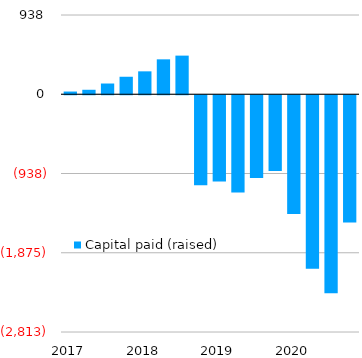
| Category | Capital paid (raised) |
|---|---|
| 2017 | 32 |
|  | 53 |
|  | 127 |
|  | 207 |
| 2018 | 271 |
|  | 413 |
|  | 457 |
|  | -1065 |
| 2019 | -1019 |
|  | -1151.9 |
|  | -979 |
|  | -897 |
| 2020 | -1406 |
|  | -2052 |
|  | -2343 |
|  | -1506.051 |